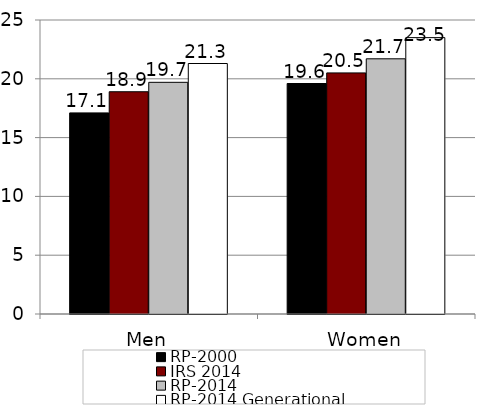
| Category | RP-2000 | IRS 2014 | RP-2014 | RP-2014 Generational |
|---|---|---|---|---|
| Men | 17.1 | 18.9 | 19.7 | 21.3 |
| Women | 19.6 | 20.5 | 21.7 | 23.5 |